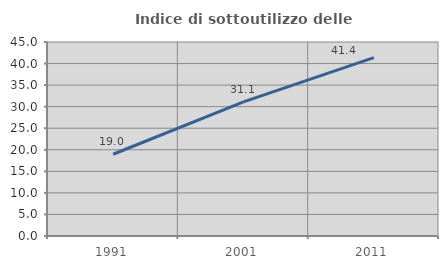
| Category | Indice di sottoutilizzo delle abitazioni  |
|---|---|
| 1991.0 | 18.96 |
| 2001.0 | 31.127 |
| 2011.0 | 41.379 |